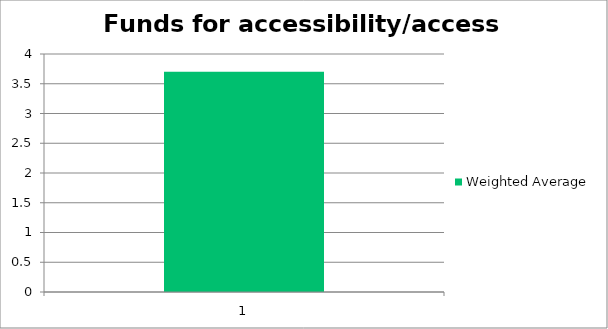
| Category | Weighted Average |
|---|---|
| 1.0 | 3.7 |